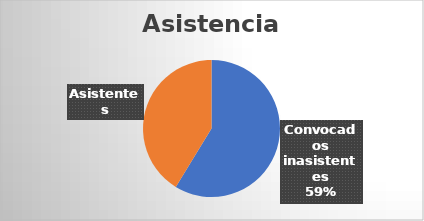
| Category | Series 0 |
|---|---|
| Convocados inasistentes | 37 |
| Asistentes | 26 |